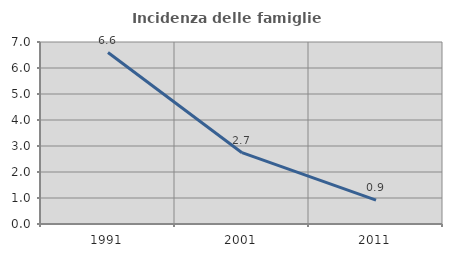
| Category | Incidenza delle famiglie numerose |
|---|---|
| 1991.0 | 6.593 |
| 2001.0 | 2.743 |
| 2011.0 | 0.915 |